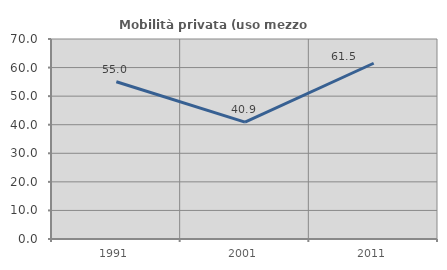
| Category | Mobilità privata (uso mezzo privato) |
|---|---|
| 1991.0 | 55.034 |
| 2001.0 | 40.888 |
| 2011.0 | 61.514 |